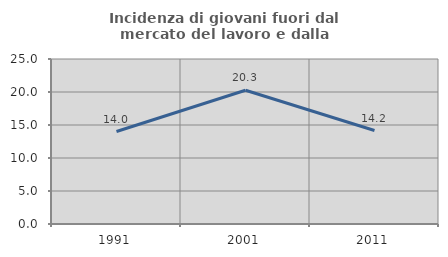
| Category | Incidenza di giovani fuori dal mercato del lavoro e dalla formazione  |
|---|---|
| 1991.0 | 14.009 |
| 2001.0 | 20.268 |
| 2011.0 | 14.159 |